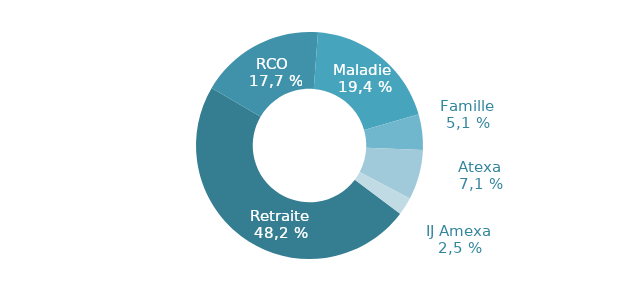
| Category | Series 0 |
|---|---|
| ü retraite | 0.482 |
| ü retraite complémentaire obligatoire | 0.177 |
| ü maladie et invalidité | 0.194 |
| ü famille | 0.051 |
| ü accident du travail et maladie professionnelle | 0.071 |
| ü IJ AMEXA | 0.025 |